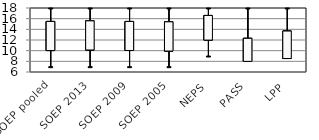
| Category | Series 0 | Series 1 | Series 2 | Series 3 |
|---|---|---|---|---|
| SOEP pooled | 10.02 | 18 | 7 | 15.48 |
| SOEP 2013 | 10.127 | 18 | 7 | 15.589 |
| SOEP 2009 | 10.029 | 18 | 7 | 15.477 |
| SOEP 2005 | 9.93 | 18 | 7 | 15.41 |
| NEPS | 11.983 | 18 | 9 | 16.601 |
| PASS | 7.99 | 18 | 9 | 12.312 |
| LPP | 8.526 | 18 | 9 | 13.68 |